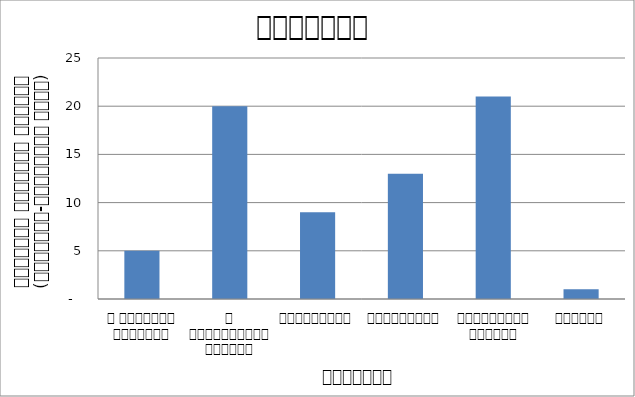
| Category | कुटनीति |
|---|---|
| द हिमालयन टाइम्स् | 5 |
| द काठमाण्डौं पोस्ट् | 20 |
| रिपब्लिका | 9 |
| कान्तिपुर | 13 |
| अन्नपूर्ण पोस्ट् | 21 |
| नागरिक | 1 |